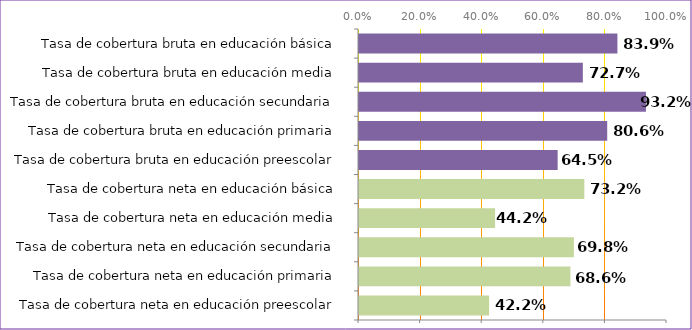
| Category | Series 0 |
|---|---|
| Tasa de cobertura neta en educación preescolar | 0.422 |
| Tasa de cobertura neta en educación primaria | 0.686 |
| Tasa de cobertura neta en educación secundaria | 0.698 |
| Tasa de cobertura neta en educación media | 0.442 |
| Tasa de cobertura neta en educación básica | 0.732 |
| Tasa de cobertura bruta en educación preescolar | 0.645 |
| Tasa de cobertura bruta en educación primaria | 0.806 |
| Tasa de cobertura bruta en educación secundaria | 0.932 |
| Tasa de cobertura bruta en educación media | 0.727 |
| Tasa de cobertura bruta en educación básica | 0.839 |